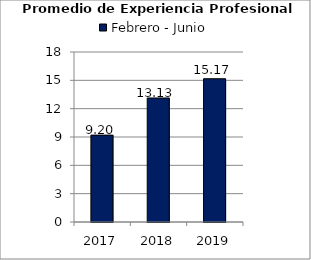
| Category | Febrero - Junio |
|---|---|
| 2017.0 | 9.2 |
| 2018.0 | 13.13 |
| 2019.0 | 15.17 |